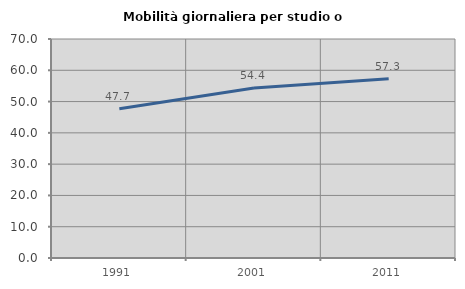
| Category | Mobilità giornaliera per studio o lavoro |
|---|---|
| 1991.0 | 47.715 |
| 2001.0 | 54.361 |
| 2011.0 | 57.303 |